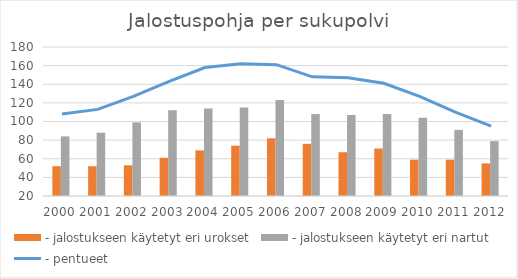
| Category | - jalostukseen käytetyt eri urokset | - jalostukseen käytetyt eri nartut |
|---|---|---|
| 2000.0 | 52 | 84 |
| 2001.0 | 52 | 88 |
| 2002.0 | 53 | 99 |
| 2003.0 | 61 | 112 |
| 2004.0 | 69 | 114 |
| 2005.0 | 74 | 115 |
| 2006.0 | 82 | 123 |
| 2007.0 | 76 | 108 |
| 2008.0 | 67 | 107 |
| 2009.0 | 71 | 108 |
| 2010.0 | 59 | 104 |
| 2011.0 | 59 | 91 |
| 2012.0 | 55 | 79 |